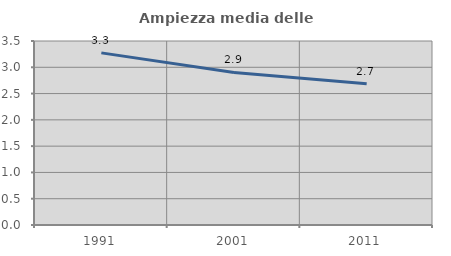
| Category | Ampiezza media delle famiglie |
|---|---|
| 1991.0 | 3.274 |
| 2001.0 | 2.903 |
| 2011.0 | 2.685 |